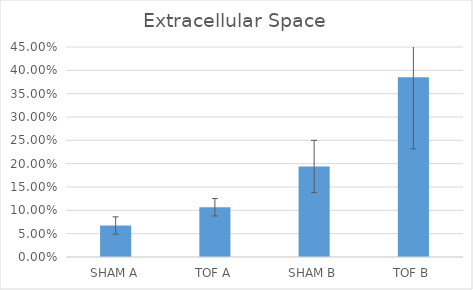
| Category | Extracellular Space |
|---|---|
| SHAM A | 0.067 |
| TOF A | 0.107 |
| SHAM B | 0.194 |
| TOF B | 0.385 |